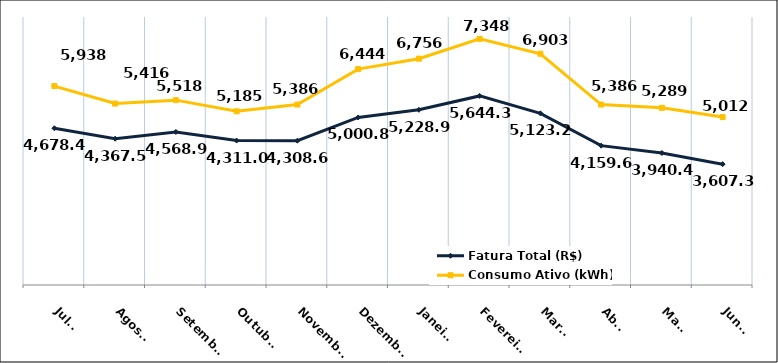
| Category | Fatura Total (R$) | Consumo Ativo (kWh) |
|---|---|---|
| Julho | 4678.43 | 5938 |
| Agosto | 4367.57 | 5416 |
| Setembro | 4568.91 | 5518 |
| Outubro | 4311.01 | 5185 |
| Novembro | 4308.68 | 5386 |
| Dezembro | 5000.86 | 6444 |
| Janeiro | 5228.92 | 6756 |
| Fevereiro | 5644.33 | 7348 |
| Março | 5123.21 | 6903 |
| Abril | 4159.65 | 5386 |
| Maio | 3940.47 | 5289 |
| Junho | 3607.38 | 5012 |